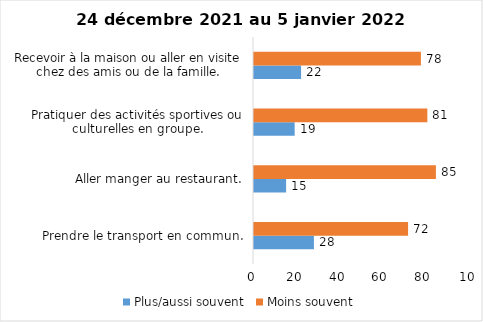
| Category | Plus/aussi souvent | Moins souvent |
|---|---|---|
| Prendre le transport en commun. | 28 | 72 |
| Aller manger au restaurant. | 15 | 85 |
| Pratiquer des activités sportives ou culturelles en groupe. | 19 | 81 |
| Recevoir à la maison ou aller en visite chez des amis ou de la famille. | 22 | 78 |